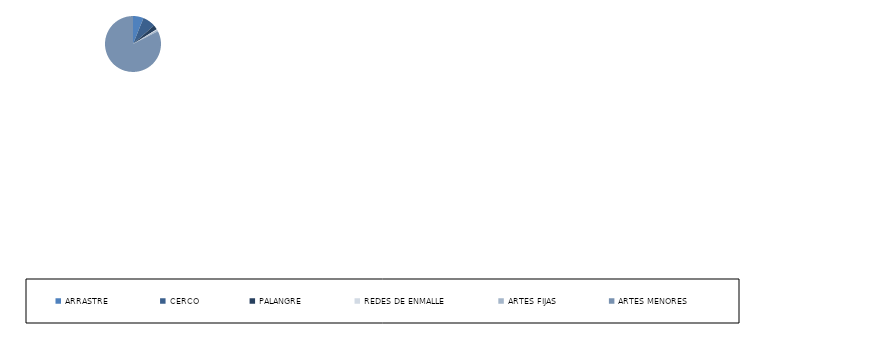
| Category | Series 0 |
|---|---|
| ARRASTRE | 14 |
| CERCO | 17 |
| PALANGRE | 6 |
| REDES DE ENMALLE | 1 |
| ARTES FIJAS | 2 |
| ARTES MENORES | 189 |